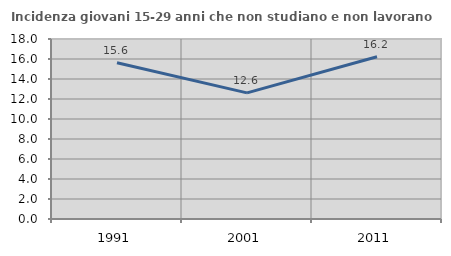
| Category | Incidenza giovani 15-29 anni che non studiano e non lavorano  |
|---|---|
| 1991.0 | 15.625 |
| 2001.0 | 12.616 |
| 2011.0 | 16.222 |